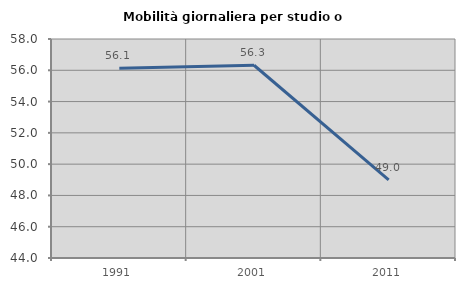
| Category | Mobilità giornaliera per studio o lavoro |
|---|---|
| 1991.0 | 56.122 |
| 2001.0 | 56.322 |
| 2011.0 | 49 |